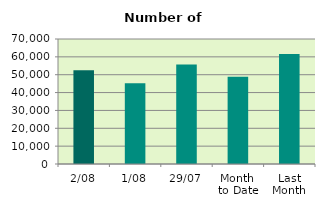
| Category | Series 0 |
|---|---|
| 2/08 | 52514 |
| 1/08 | 45206 |
| 29/07 | 55766 |
| Month 
to Date | 48860 |
| Last
Month | 61549.619 |